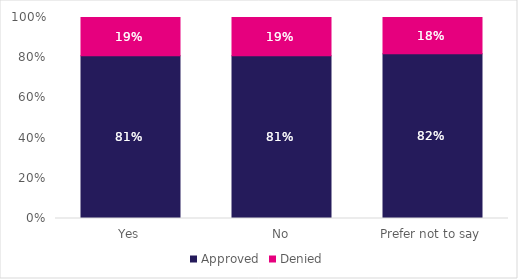
| Category | Approved | Denied |
|---|---|---|
| Yes | 0.81 | 0.19 |
| No | 0.81 | 0.19 |
| Prefer not to say | 0.82 | 0.18 |